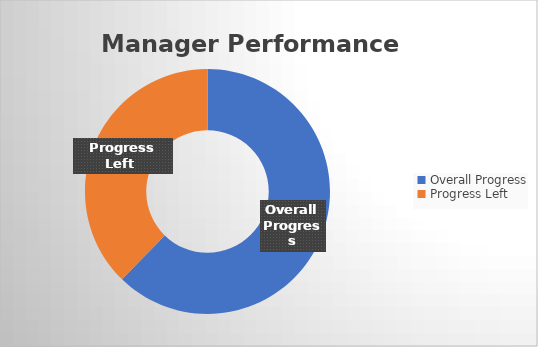
| Category | Series 0 |
|---|---|
| Overall Progress | 45.47 |
| Progress Left  | 27.53 |